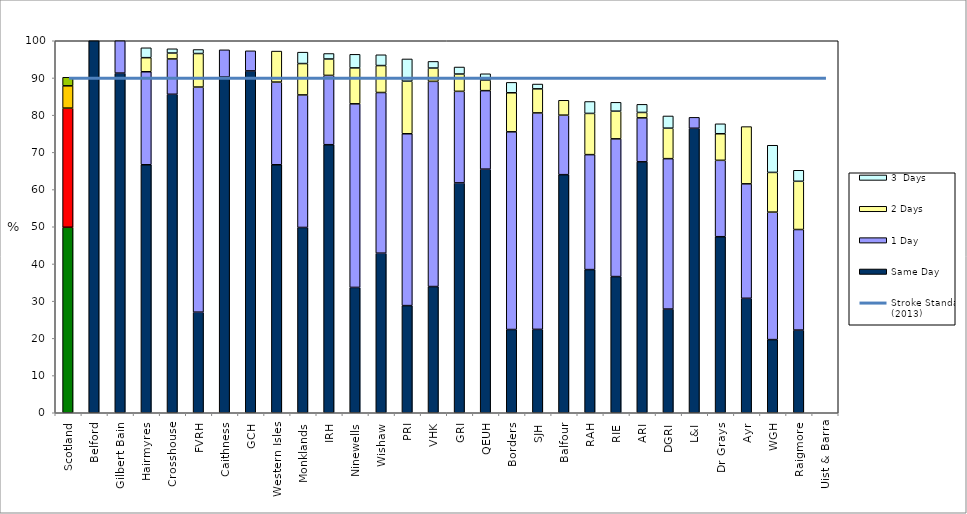
| Category | Same Day | 1 Day | 2 Days | 3  Days |
|---|---|---|---|---|
| Scotland | 49.862 | 32.029 | 5.99 | 2.303 |
| Belford | 100 | 0 | 0 | 0 |
| Gilbert Bain | 91.304 | 8.696 | 0 | 0 |
| Hairmyres | 66.667 | 25 | 3.788 | 2.652 |
| Crosshouse | 85.612 | 9.496 | 1.583 | 1.151 |
| FVRH | 27.039 | 60.515 | 9.013 | 1.073 |
| Caithness | 90.244 | 7.317 | 0 | 0 |
| GCH | 91.892 | 5.405 | 0 | 0 |
| Western Isles | 66.667 | 22.222 | 8.333 | 0 |
| Monklands | 49.808 | 35.632 | 8.429 | 3.065 |
| IRH | 72.059 | 18.627 | 4.412 | 1.471 |
| Ninewells | 33.691 | 49.356 | 9.657 | 3.648 |
| Wishaw | 42.899 | 43.188 | 7.246 | 2.899 |
| PRI | 28.804 | 46.196 | 14.13 | 5.978 |
| VHK | 33.929 | 55.159 | 3.571 | 1.786 |
| GRI | 61.79 | 24.613 | 4.647 | 1.893 |
| QEUH | 65.483 | 21.105 | 2.86 | 1.677 |
| Borders | 22.378 | 53.147 | 10.49 | 2.797 |
| SJH | 22.414 | 58.19 | 6.466 | 1.293 |
| Balfour | 64 | 16 | 4 | 0 |
| RAH | 38.484 | 30.904 | 11.079 | 3.207 |
| RIE | 36.606 | 37.027 | 7.433 | 2.384 |
| ARI | 67.455 | 11.818 | 1.455 | 2.182 |
| DGRI | 27.869 | 40.437 | 8.197 | 3.279 |
| L&I | 76.471 | 2.941 | 0 | 0 |
| Dr Grays | 47.321 | 20.536 | 7.143 | 2.679 |
| Ayr | 30.769 | 30.769 | 15.385 | 0 |
| WGH | 19.663 | 34.27 | 10.674 | 7.303 |
| Raigmore | 22.222 | 27.037 | 12.963 | 2.963 |
| Uist & Barra | 0 | 0 | 0 | 0 |